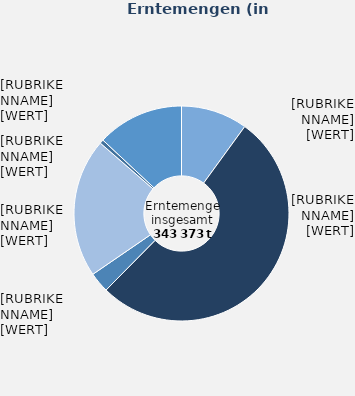
| Category | Erntemengen |
|---|---|
| Rotkohl | 33203 |
| Weißkohl | 173647 |
| Wirsing | 0 |
| Blumenkohl | 10114 |
| Speisemöhren/ Karotten | 69417 |
| Spargel im Ertrag stehend | 1944 |
| Sonstige | 43248 |